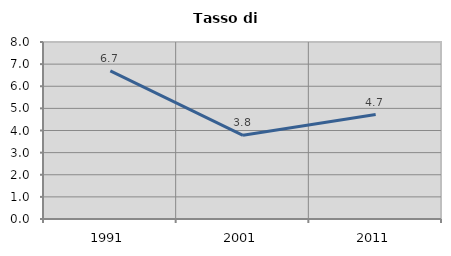
| Category | Tasso di disoccupazione   |
|---|---|
| 1991.0 | 6.699 |
| 2001.0 | 3.783 |
| 2011.0 | 4.722 |